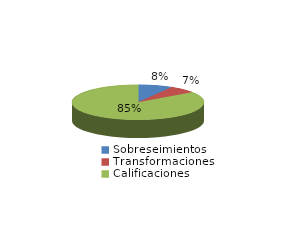
| Category | Series 0 |
|---|---|
| Sobreseimientos | 130 |
| Transformaciones | 104 |
| Calificaciones | 1315 |